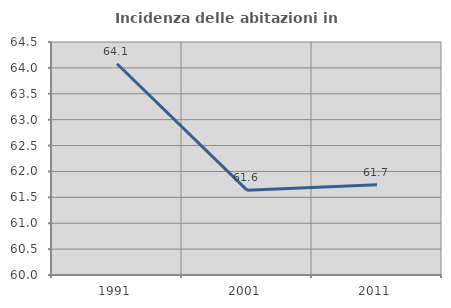
| Category | Incidenza delle abitazioni in proprietà  |
|---|---|
| 1991.0 | 64.08 |
| 2001.0 | 61.639 |
| 2011.0 | 61.741 |